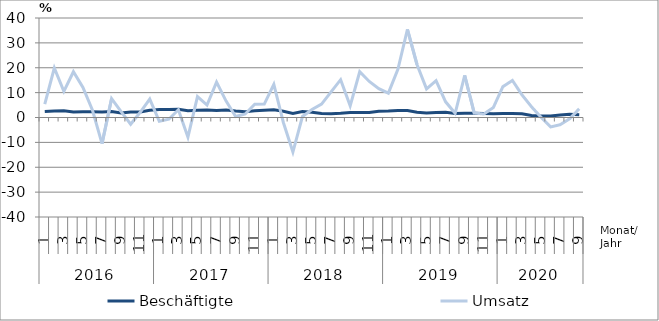
| Category | Beschäftigte | Umsatz |
|---|---|---|
| 0 | 2.4 | 5.4 |
| 1 | 2.6 | 19.9 |
| 2 | 2.7 | 10.5 |
| 3 | 2.2 | 18.4 |
| 4 | 2.3 | 12.1 |
| 5 | 2.3 | 2.9 |
| 6 | 2.2 | -10.5 |
| 7 | 2.4 | 7.6 |
| 8 | 1.8 | 2.4 |
| 9 | 2.2 | -2.7 |
| 10 | 2.2 | 2.1 |
| 11 | 2.9 | 7.4 |
| 12 | 3.2 | -1.5 |
| 13 | 3.2 | -0.7 |
| 14 | 3.3 | 3.1 |
| 15 | 2.7 | -7.9 |
| 16 | 2.9 | 8.4 |
| 17 | 3 | 5 |
| 18 | 2.8 | 14.2 |
| 19 | 3 | 6.6 |
| 20 | 2.6 | 0.4 |
| 21 | 2.3 | 1.4 |
| 22 | 2.7 | 5.3 |
| 23 | 2.9 | 5.4 |
| 24 | 3.1 | 13.3 |
| 25 | 2.5 | -2 |
| 26 | 1.6 | -13.9 |
| 27 | 2.4 | 0.4 |
| 28 | 2.1 | 3.2 |
| 29 | 1.6 | 5.4 |
| 30 | 1.5 | 10.3 |
| 31 | 1.7 | 15.2 |
| 32 | 2 | 4.7 |
| 33 | 2 | 18.4 |
| 34 | 2 | 14.5 |
| 35 | 2.5 | 11.6 |
| 36 | 2.6 | 9.8 |
| 37 | 2.8 | 19.4 |
| 38 | 2.8 | 35.4 |
| 39 | 2.1 | 21.3 |
| 40 | 1.8 | 11.5 |
| 41 | 2 | 14.8 |
| 42 | 2.1 | 6.3 |
| 43 | 1.6 | 1.7 |
| 44 | 1.7 | 16.9 |
| 45 | 1.7 | 1.8 |
| 46 | 1.6 | 1.4 |
| 47 | 1.5 | 4 |
| 48 | 1.6 | 12.4 |
| 49 | 1.6 | 14.9 |
| 50 | 1.5 | 9.1 |
| 51 | 0.8 | 4.3 |
| 52 | 0.6 | 0.1 |
| 53 | 0.6 | -3.8 |
| 54 | 1 | -2.9 |
| 55 | 1.3 | -0.5 |
| 56 | 1.1 | 3.5 |